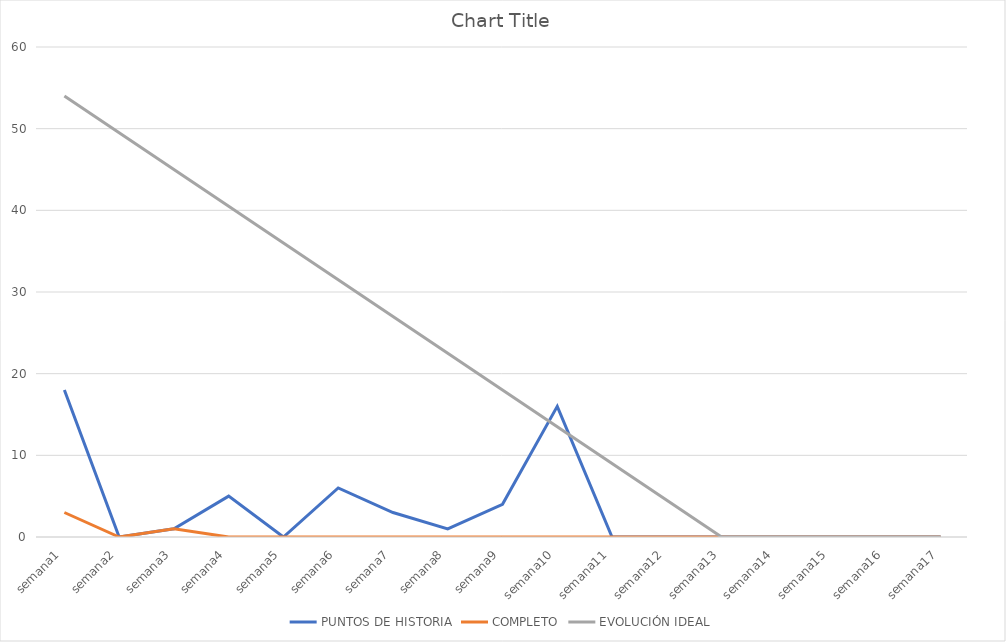
| Category | PUNTOS DE HISTORIA | COMPLETO | EVOLUCIÓN IDEAL |
|---|---|---|---|
| semana1 | 18 | 3 | 54 |
| semana2 | 0 | 0 | 49.5 |
| semana3 | 1 | 1 | 45 |
| semana4 | 5 | 0 | 40.5 |
| semana5 | 0 | 0 | 36 |
| semana6 | 6 | 0 | 31.5 |
| semana7 | 3 | 0 | 27 |
| semana8 | 1 | 0 | 22.5 |
| semana9 | 4 | 0 | 18 |
| semana10 | 16 | 0 | 13.5 |
| semana11 | 0 | 0 | 9 |
| semana12 | 0 | 0 | 4.5 |
| semana13 | 0 | 0 | 0 |
| semana14 | 0 | 0 | 0 |
| semana15 | 0 | 0 | 0 |
| semana16 | 0 | 0 | 0 |
| semana17 | 0 | 0 | 0 |